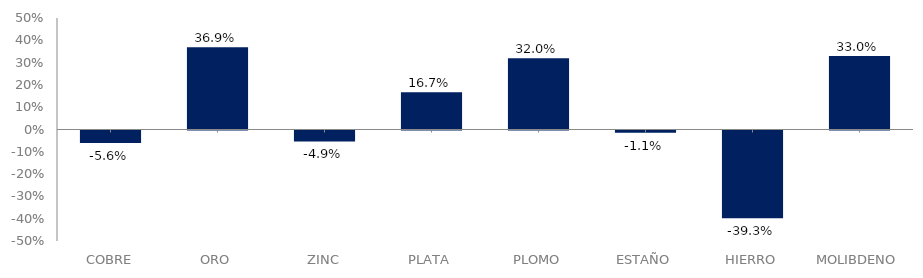
| Category | Series 0 |
|---|---|
| COBRE | -0.056 |
| ORO | 0.369 |
| ZINC | -0.049 |
| PLATA | 0.167 |
| PLOMO | 0.32 |
| ESTAÑO | -0.011 |
| HIERRO | -0.393 |
| MOLIBDENO | 0.33 |